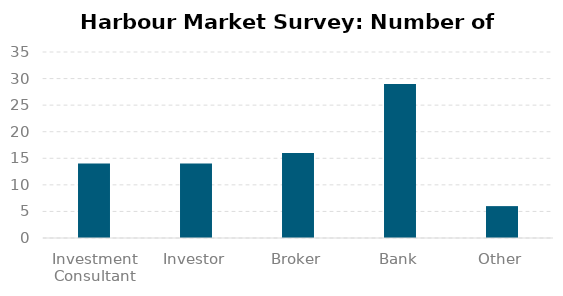
| Category | Series 0 |
|---|---|
| Investment Consultant | 14 |
| Investor | 14 |
| Broker | 16 |
| Bank | 29 |
| Other | 6 |